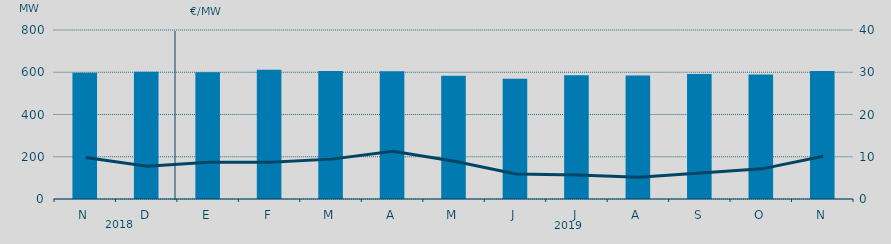
| Category | Energia (MWh) a subir |
|---|---|
| N | 597.847 |
| D | 602.253 |
| E | 600.235 |
| F | 612.121 |
| M | 605.978 |
| A | 604.29 |
| M | 583.379 |
| J | 569.496 |
| J | 585.727 |
| A | 584.609 |
| S | 591.64 |
| O | 589.349 |
| N | 605.422 |